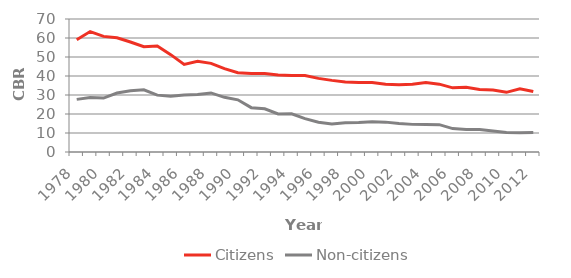
| Category | Citizens | Non-citizens |
|---|---|---|
| 1978.0 | 59.043 | 27.703 |
| 1979.0 | 63.373 | 28.63 |
| 1980.0 | 60.842 | 28.404 |
| 1981.0 | 60.1 | 31.04 |
| 1982.0 | 57.898 | 32.256 |
| 1983.0 | 55.381 | 32.72 |
| 1984.0 | 55.83 | 29.924 |
| 1985.0 | 51.237 | 29.326 |
| 1986.0 | 46.092 | 30.036 |
| 1987.0 | 47.748 | 30.244 |
| 1988.0 | 46.644 | 31.097 |
| 1989.0 | 43.852 | 28.766 |
| 1990.0 | 41.721 | 27.468 |
| 1991.0 | 41.26 | 23.337 |
| 1992.0 | 41.33 | 22.717 |
| 1993.0 | 40.482 | 20.037 |
| 1994.0 | 40.306 | 20.082 |
| 1995.0 | 40.225 | 17.542 |
| 1996.0 | 38.756 | 15.663 |
| 1997.0 | 37.698 | 14.778 |
| 1998.0 | 36.844 | 15.416 |
| 1999.0 | 36.53 | 15.515 |
| 2000.0 | 36.621 | 15.973 |
| 2001.0 | 35.625 | 15.722 |
| 2002.0 | 35.376 | 15.011 |
| 2003.0 | 35.615 | 14.539 |
| 2004.0 | 36.549 | 14.41 |
| 2005.0 | 35.711 | 14.387 |
| 2006.0 | 33.775 | 12.325 |
| 2007.0 | 34.045 | 11.802 |
| 2008.0 | 32.952 | 11.849 |
| 2009.0 | 32.581 | 11.022 |
| 2010.0 | 31.4 | 10.314 |
| 2011.0 | 33.3 | 10.195 |
| 2012.0 | 31.821 | 10.297 |